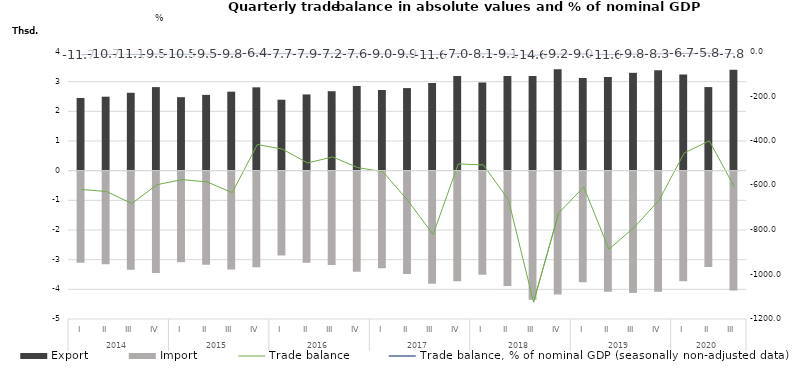
| Category | Export | Import |
|---|---|---|
| 0 | 2450.7 | -3068.8 |
| 1 | 2493.4 | -3120.5 |
| 2 | 2625.5 | -3306.5 |
| 3 | 2816.7 | -3413.2 |
| 4 | 2476.5 | -3050.1 |
| 5 | 2555.2 | -3139.2 |
| 6 | 2663.4 | -3295.5 |
| 7 | 2809.5 | -3225.4 |
| 8 | 2391.5 | -2828.1 |
| 9 | 2569.5 | -3068 |
| 10 | 2678.2 | -3149.9 |
| 11 | 2850.8 | -3370.5 |
| 12 | 2719.6 | -3257.4 |
| 13 | 2783.8 | -3452 |
| 14 | 2956.9 | -3777.4 |
| 15 | 3187 | -3690 |
| 16 | 2969.9 | -3477.4 |
| 17 | 3193.3 | -3857.4 |
| 18 | 3189.7 | -4313.9 |
| 19 | 3420.5 | -4144.2 |
| 20 | 3123.6 | -3730.2 |
| 21 | 3158.2 | -4044.8 |
| 22 | 3298.5 | -4087.5 |
| 23 | 3385.3 | -4051.1 |
| 24 | 3239 | -3692.6 |
| 25 | 2818 | -3217.4 |
| 26 | 3401.8 | -4008.6 |